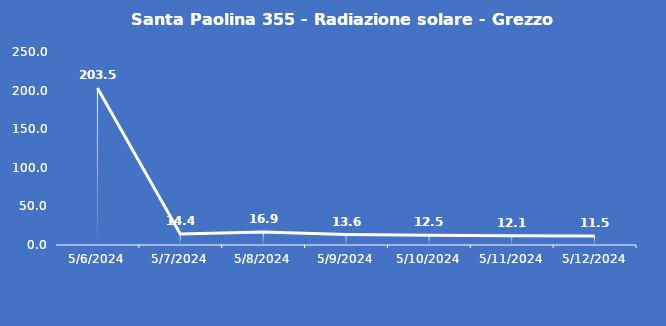
| Category | Santa Paolina 355 - Radiazione solare - Grezzo (W/m2) |
|---|---|
| 5/6/24 | 203.5 |
| 5/7/24 | 14.4 |
| 5/8/24 | 16.9 |
| 5/9/24 | 13.6 |
| 5/10/24 | 12.5 |
| 5/11/24 | 12.1 |
| 5/12/24 | 11.5 |